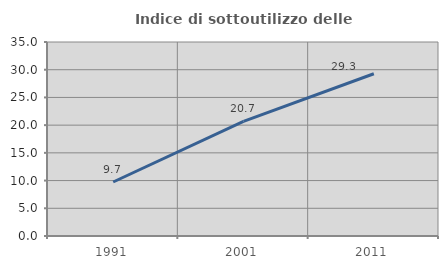
| Category | Indice di sottoutilizzo delle abitazioni  |
|---|---|
| 1991.0 | 9.74 |
| 2001.0 | 20.69 |
| 2011.0 | 29.268 |